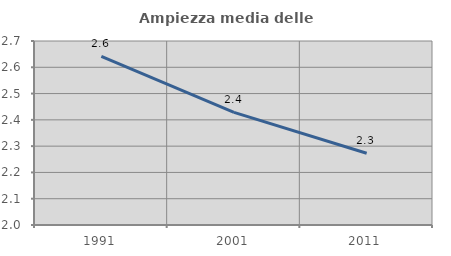
| Category | Ampiezza media delle famiglie |
|---|---|
| 1991.0 | 2.641 |
| 2001.0 | 2.429 |
| 2011.0 | 2.273 |